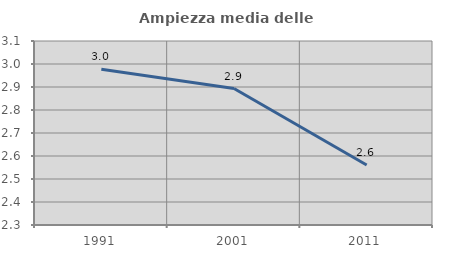
| Category | Ampiezza media delle famiglie |
|---|---|
| 1991.0 | 2.977 |
| 2001.0 | 2.893 |
| 2011.0 | 2.561 |